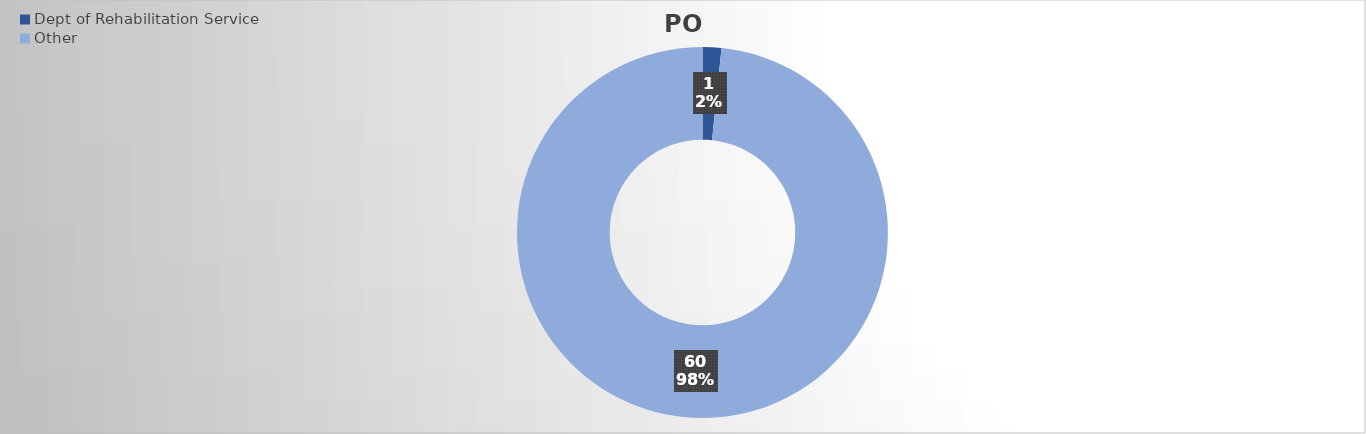
| Category | PO Lines |
|---|---|
| Dept of Rehabilitation Service | 1 |
| Other | 60 |